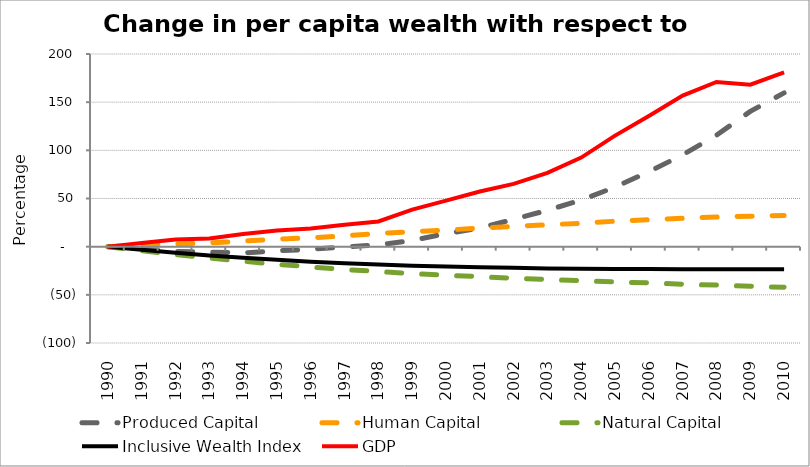
| Category | Produced Capital  | Human Capital | Natural Capital | Inclusive Wealth Index | GDP |
|---|---|---|---|---|---|
| 1990.0 | 0 | 0 | 0 | 0 | 0 |
| 1991.0 | -2.672 | 1.639 | -4.103 | -3.125 | 3.92 |
| 1992.0 | -5.048 | 2.8 | -8.126 | -6.253 | 7.547 |
| 1993.0 | -5.58 | 3.993 | -11.82 | -9.051 | 8.405 |
| 1994.0 | -6.52 | 5.745 | -15.126 | -11.459 | 13.257 |
| 1995.0 | -4.28 | 7.869 | -18.255 | -13.559 | 16.664 |
| 1996.0 | -2.812 | 9.107 | -21.064 | -15.571 | 18.947 |
| 1997.0 | -0.19 | 11.254 | -23.653 | -17.221 | 22.715 |
| 1998.0 | 1.775 | 13.709 | -25.864 | -18.538 | 26.121 |
| 1999.0 | 6.531 | 15.59 | -28.005 | -19.8 | 38.39 |
| 2000.0 | 13.457 | 17.246 | -29.622 | -20.606 | 47.833 |
| 2001.0 | 19.401 | 19.313 | -31.224 | -21.364 | 57.266 |
| 2002.0 | 28.313 | 21.109 | -32.722 | -21.986 | 65.114 |
| 2003.0 | 37.782 | 22.718 | -34.142 | -22.556 | 76.696 |
| 2004.0 | 48.422 | 24.261 | -35.394 | -22.964 | 92.459 |
| 2005.0 | 61.815 | 26.44 | -36.597 | -23.138 | 115.29 |
| 2006.0 | 77.825 | 28.018 | -37.656 | -23.208 | 135.686 |
| 2007.0 | 95.25 | 29.474 | -38.936 | -23.43 | 156.811 |
| 2008.0 | 115.703 | 30.802 | -39.918 | -23.332 | 170.987 |
| 2009.0 | 140.415 | 31.614 | -41.151 | -23.38 | 168.209 |
| 2010.0 | 159.613 | 32.349 | -42.118 | -23.408 | 181.002 |